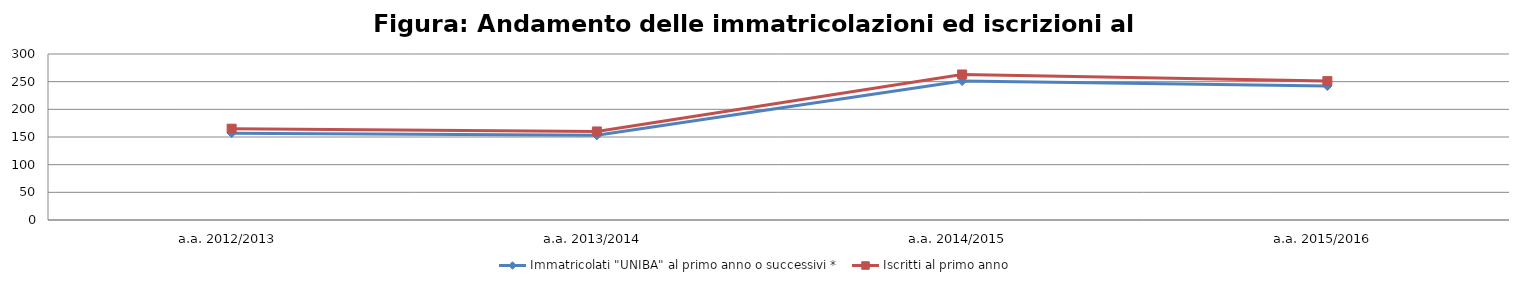
| Category | Immatricolati "UNIBA" al primo anno o successivi * | Iscritti al primo anno  |
|---|---|---|
| a.a. 2012/2013 | 157 | 165 |
| a.a. 2013/2014 | 153 | 160 |
| a.a. 2014/2015 | 251 | 263 |
| a.a. 2015/2016 | 242 | 251 |